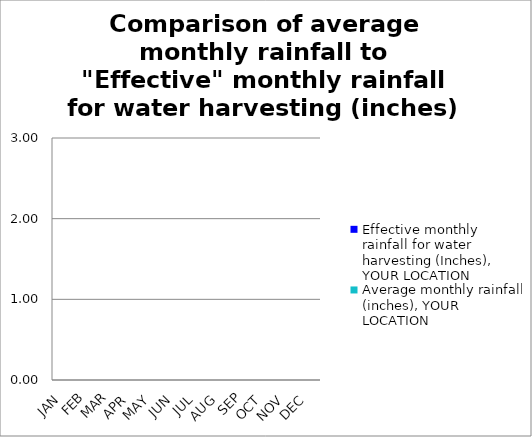
| Category | Effective monthly rainfall for water harvesting (Inches), YOUR LOCATION | Average monthly rainfall (inches), YOUR LOCATION |
|---|---|---|
| JAN | 0 | 0 |
| FEB | 0 | 0 |
| MAR | 0 | 0 |
| APR | 0 | 0 |
| MAY | 0 | 0 |
| JUN | 0 | 0 |
| JUL | 0 | 0 |
| AUG | 0 | 0 |
| SEP | 0 | 0 |
| OCT | 0 | 0 |
| NOV | 0 | 0 |
| DEC | 0 | 0 |